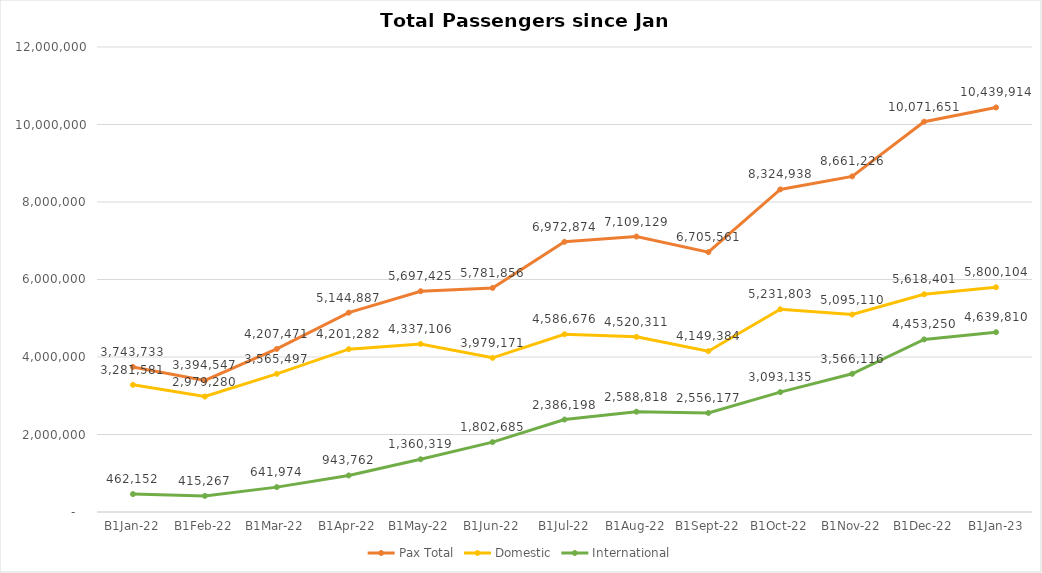
| Category | Pax Total |  Domestic  |  International  |
|---|---|---|---|
| 2022-01-01 | 3743733 | 3281581 | 462152 |
| 2022-02-01 | 3394547 | 2979280 | 415267 |
| 2022-03-01 | 4207471 | 3565497 | 641974 |
| 2022-04-01 | 5144887 | 4201282 | 943762 |
| 2022-05-01 | 5697425 | 4337106 | 1360319 |
| 2022-06-01 | 5781856 | 3979171 | 1802685 |
| 2022-07-01 | 6972874 | 4586676 | 2386198 |
| 2022-08-01 | 7109129 | 4520311 | 2588818 |
| 2022-09-01 | 6705561 | 4149384 | 2556177 |
| 2022-10-01 | 8324938 | 5231803 | 3093135 |
| 2022-11-01 | 8661226 | 5095110 | 3566116 |
| 2022-12-01 | 10071651 | 5618401 | 4453250 |
| 2023-01-01 | 10439914 | 5800104 | 4639810 |